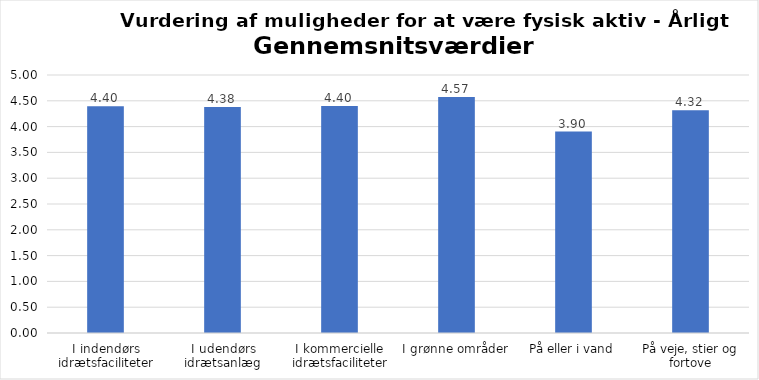
| Category | Gennemsnit |
|---|---|
| I indendørs idrætsfaciliteter | 4.396 |
| I udendørs idrætsanlæg | 4.378 |
| I kommercielle idrætsfaciliteter | 4.399 |
| I grønne områder | 4.573 |
| På eller i vand | 3.903 |
| På veje, stier og fortove | 4.318 |